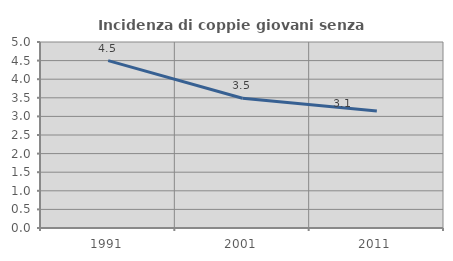
| Category | Incidenza di coppie giovani senza figli |
|---|---|
| 1991.0 | 4.5 |
| 2001.0 | 3.488 |
| 2011.0 | 3.148 |